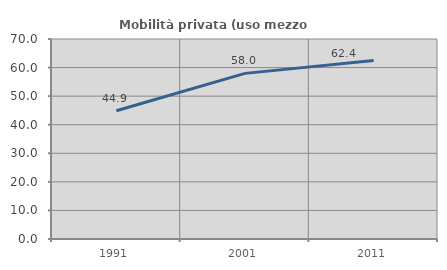
| Category | Mobilità privata (uso mezzo privato) |
|---|---|
| 1991.0 | 44.879 |
| 2001.0 | 57.967 |
| 2011.0 | 62.449 |